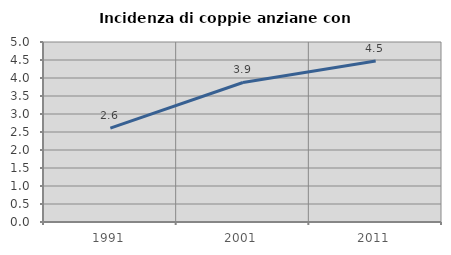
| Category | Incidenza di coppie anziane con figli |
|---|---|
| 1991.0 | 2.609 |
| 2001.0 | 3.876 |
| 2011.0 | 4.471 |